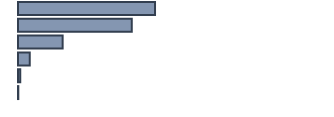
| Category | Series 0 |
|---|---|
| 0 | 44.2 |
| 1 | 36.7 |
| 2 | 14.4 |
| 3 | 3.8 |
| 4 | 0.7 |
| 5 | 0.1 |